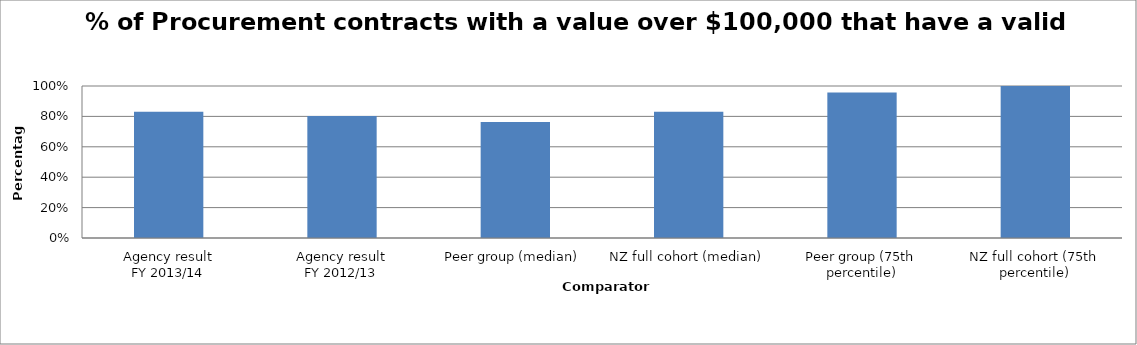
| Category | Series 0 |
|---|---|
| Agency result
FY 2013/14 | 0.831 |
| Agency result
FY 2012/13 | 0.803 |
| Peer group (median) | 0.764 |
| NZ full cohort (median) | 0.83 |
| Peer group (75th percentile) | 0.958 |
| NZ full cohort (75th percentile) | 1 |